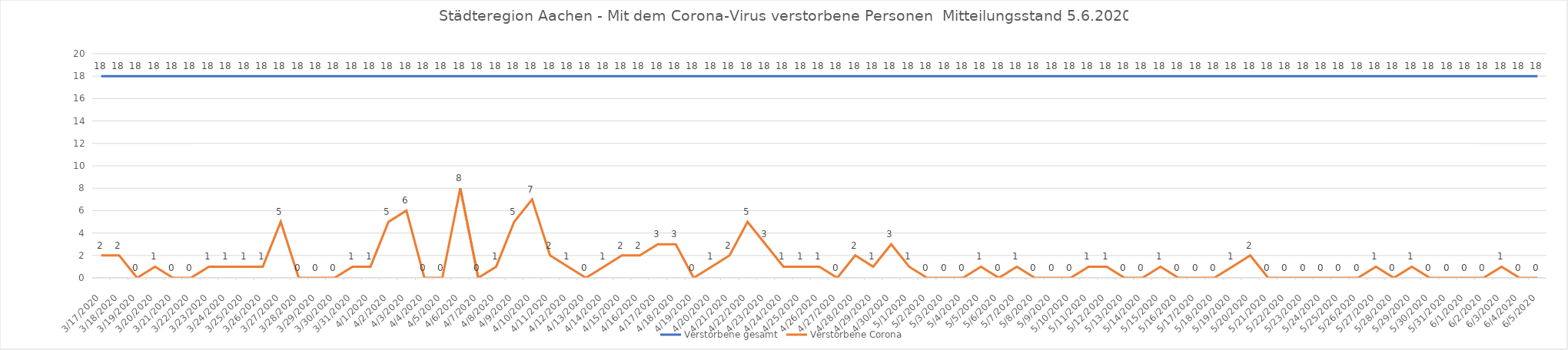
| Category | Verstorbene gesamt | Verstorbene Corona |
|---|---|---|
| 3/17/20 | 18 | 2 |
| 3/18/20 | 18 | 2 |
| 3/19/20 | 18 | 0 |
| 3/20/20 | 18 | 1 |
| 3/21/20 | 18 | 0 |
| 3/22/20 | 18 | 0 |
| 3/23/20 | 18 | 1 |
| 3/24/20 | 18 | 1 |
| 3/25/20 | 18 | 1 |
| 3/26/20 | 18 | 1 |
| 3/27/20 | 18 | 5 |
| 3/28/20 | 18 | 0 |
| 3/29/20 | 18 | 0 |
| 3/30/20 | 18 | 0 |
| 3/31/20 | 18 | 1 |
| 4/1/20 | 18 | 1 |
| 4/2/20 | 18 | 5 |
| 4/3/20 | 18 | 6 |
| 4/4/20 | 18 | 0 |
| 4/5/20 | 18 | 0 |
| 4/6/20 | 18 | 8 |
| 4/7/20 | 18 | 0 |
| 4/8/20 | 18 | 1 |
| 4/9/20 | 18 | 5 |
| 4/10/20 | 18 | 7 |
| 4/11/20 | 18 | 2 |
| 4/12/20 | 18 | 1 |
| 4/13/20 | 18 | 0 |
| 4/14/20 | 18 | 1 |
| 4/15/20 | 18 | 2 |
| 4/16/20 | 18 | 2 |
| 4/17/20 | 18 | 3 |
| 4/18/20 | 18 | 3 |
| 4/19/20 | 18 | 0 |
| 4/20/20 | 18 | 1 |
| 4/21/20 | 18 | 2 |
| 4/22/20 | 18 | 5 |
| 4/23/20 | 18 | 3 |
| 4/24/20 | 18 | 1 |
| 4/25/20 | 18 | 1 |
| 4/26/20 | 18 | 1 |
| 4/27/20 | 18 | 0 |
| 4/28/20 | 18 | 2 |
| 4/29/20 | 18 | 1 |
| 4/30/20 | 18 | 3 |
| 5/1/20 | 18 | 1 |
| 5/2/20 | 18 | 0 |
| 5/3/20 | 18 | 0 |
| 5/4/20 | 18 | 0 |
| 5/5/20 | 18 | 1 |
| 5/6/20 | 18 | 0 |
| 5/7/20 | 18 | 1 |
| 5/8/20 | 18 | 0 |
| 5/9/20 | 18 | 0 |
| 5/10/20 | 18 | 0 |
| 5/11/20 | 18 | 1 |
| 5/12/20 | 18 | 1 |
| 5/13/20 | 18 | 0 |
| 5/14/20 | 18 | 0 |
| 5/15/20 | 18 | 1 |
| 5/16/20 | 18 | 0 |
| 5/17/20 | 18 | 0 |
| 5/18/20 | 18 | 0 |
| 5/19/20 | 18 | 1 |
| 5/20/20 | 18 | 2 |
| 5/21/20 | 18 | 0 |
| 5/22/20 | 18 | 0 |
| 5/23/20 | 18 | 0 |
| 5/24/20 | 18 | 0 |
| 5/25/20 | 18 | 0 |
| 5/26/20 | 18 | 0 |
| 5/27/20 | 18 | 1 |
| 5/28/20 | 18 | 0 |
| 5/29/20 | 18 | 1 |
| 5/30/20 | 18 | 0 |
| 5/31/20 | 18 | 0 |
| 6/1/20 | 18 | 0 |
| 6/2/20 | 18 | 0 |
| 6/3/20 | 18 | 1 |
| 6/4/20 | 18 | 0 |
| 6/5/20 | 18 | 0 |